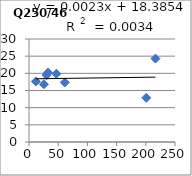
| Category | Q250/465 |
|---|---|
| 25.5 | 16.82 |
| 61.3 | 17.35 |
| 11.7 | 17.63 |
| 216.5 | 24.3 |
| 46.8 | 19.88 |
| 32.5 | 20.21 |
| 200.8 | 12.88 |
| 30.1 | 19.48 |